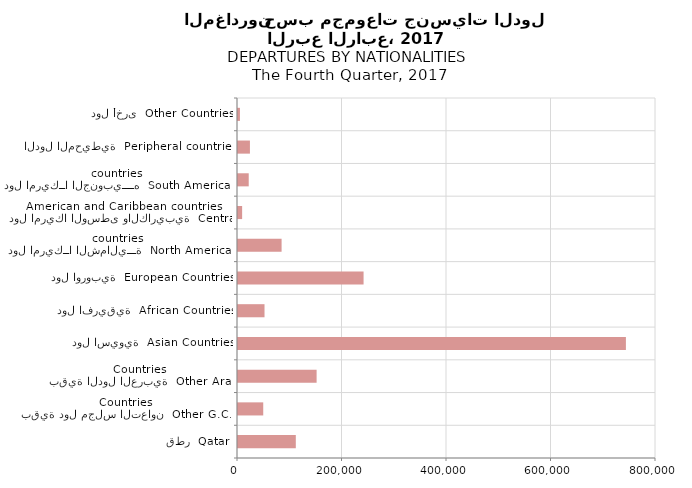
| Category | Series 0 |
|---|---|
| قطر  Qatar | 110638 |
| بقية دول مجلس التعاون  Other G.C.C Countries | 48298 |
| بقية الدول العربية  Other Arab Countries | 150450 |
| دول اسيوية  Asian Countries | 742401 |
| دول افريقية  African Countries | 50748 |
| دول اوروبية  European Countries | 240331 |
| دول امريكــا الشماليـــة  North American countries  | 83425 |
| دول امريكا الوسطى والكاريبية  Central American and Caribbean countries | 7907 |
| دول امريكــا الجنوبيــــه  South American countries | 20514 |
| الدول المحيطية  Peripheral countries | 22825 |
| دول أخرى  Other Countries | 3709 |